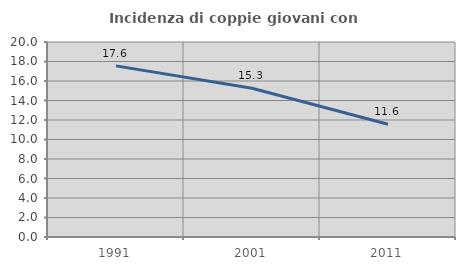
| Category | Incidenza di coppie giovani con figli |
|---|---|
| 1991.0 | 17.552 |
| 2001.0 | 15.254 |
| 2011.0 | 11.562 |